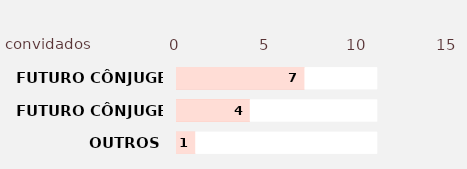
| Category | Series 2 | Series 3 | Series 1 | Series 0 |
|---|---|---|---|---|
| OUTROS | 11 | 1 | 11 | 1 |
| FUTURO CÔNJUGE 2 | 11 | 4 | 11 | 4 |
| FUTURO CÔNJUGE 1 | 11 | 7 | 11 | 7 |